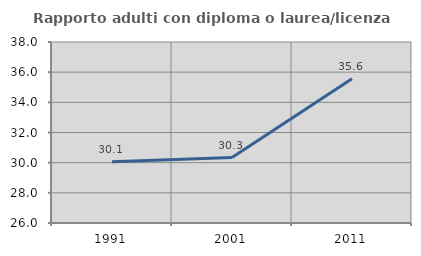
| Category | Rapporto adulti con diploma o laurea/licenza media  |
|---|---|
| 1991.0 | 30.058 |
| 2001.0 | 30.337 |
| 2011.0 | 35.57 |